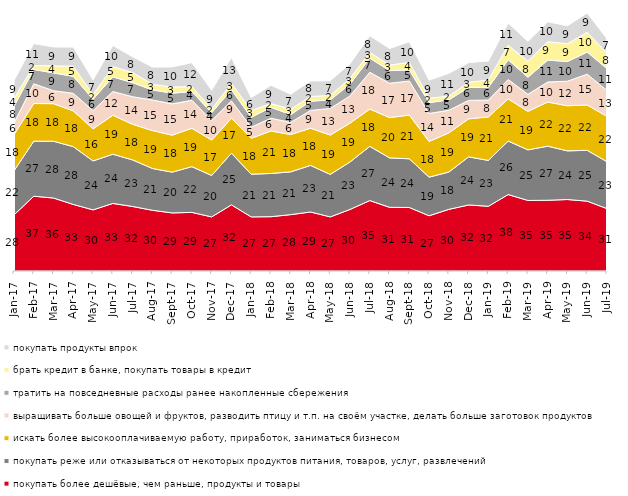
| Category | покупать более дешёвые, чем раньше, продукты и товары | покупать реже или отказываться от некоторых продуктов питания, товаров, услуг, развлечений | искать более высокооплачиваемую работу, приработок, заниматься бизнесом | выращивать больше овощей и фруктов, разводить птицу и т.п. на своём участке, делать больше заготовок продуктов  | тратить на повседневные расходы ранее накопленные сбережения | брать кредит в банке, покупать товары в кредит | покупать продукты впрок |
|---|---|---|---|---|---|---|---|
| 2017-01-01 | 27.5 | 21.65 | 17.8 | 5.7 | 8.15 | 3.75 | 8.85 |
| 2017-02-01 | 36.7 | 27 | 18.45 | 9.7 | 7.05 | 1.85 | 10.8 |
| 2017-03-01 | 35.8 | 27.85 | 18.45 | 6.35 | 8.7 | 3.5 | 9.25 |
| 2017-04-01 | 32.65 | 28.35 | 17.55 | 8.6 | 8.35 | 4.95 | 9.4 |
| 2017-05-01 | 30 | 24 | 15.75 | 8.9 | 5.6 | 2.2 | 7.3 |
| 2017-06-01 | 33.15 | 24.15 | 19.1 | 11.65 | 7.2 | 5 | 10.35 |
| 2017-07-01 | 31.65 | 22.85 | 17.5 | 13.5 | 6.9 | 4.95 | 7.75 |
| 2017-08-01 | 29.8 | 20.5 | 18.6 | 15 | 4.95 | 2.75 | 8.45 |
| 2017-09-01 | 28.5 | 20 | 18.15 | 15.35 | 5.25 | 3 | 9.85 |
| 2017-10-01 | 28.75 | 22.45 | 18.8 | 13.75 | 4.3 | 2.45 | 11.7 |
| 2017-11-01 | 26.55 | 20.3 | 17.4 | 9.6 | 3.8 | 1.7 | 9.3 |
| 2017-12-01 | 32.45 | 25.35 | 17.1 | 8.55 | 5.55 | 3.05 | 12.7 |
| 2018-01-01 | 26.55 | 20.95 | 17.6 | 5.45 | 4.85 | 3.3 | 6.35 |
| 2018-02-01 | 26.65 | 21.2 | 20.85 | 6.25 | 5.35 | 1.85 | 9 |
| 2018-03-01 | 27.65 | 21 | 18.3 | 5.95 | 3.85 | 2.65 | 7.35 |
| 2018-04-01 | 28.95 | 22.85 | 18.25 | 8.7 | 4.55 | 2.35 | 7.55 |
| 2018-05-01 | 26.55 | 20.85 | 19.3 | 13.05 | 4.2 | 2.15 | 7.25 |
| 2018-06-01 | 30.2 | 23.3 | 19.05 | 13.35 | 5.8 | 2.8 | 7.2 |
| 2018-07-01 | 34.55 | 26.6 | 18.3 | 18.05 | 6.95 | 2.75 | 8.25 |
| 2018-08-01 | 31.25 | 24.25 | 19.75 | 16.85 | 6.2 | 2.7 | 8.15 |
| 2018-09-01 | 31.15 | 23.9 | 21.45 | 16.7 | 5.45 | 3.7 | 10.1 |
| 2018-10-01 | 27.1 | 18.95 | 17.5 | 13.75 | 5.3 | 2.2 | 8.8 |
| 2018-11-01 | 30.24 | 18.313 | 19.212 | 11.078 | 5.14 | 1.796 | 11.178 |
| 2018-12-01 | 32.4 | 23.6 | 18.65 | 9.05 | 6.35 | 2.5 | 9.7 |
| 2019-01-01 | 31.75 | 22.5 | 21.35 | 8.25 | 6.25 | 3.65 | 9.25 |
| 2019-02-01 | 37.5 | 26.25 | 20.7 | 9.5 | 9.7 | 7.05 | 10.95 |
| 2019-03-01 | 34.61 | 24.814 | 18.896 | 8.354 | 8.404 | 7.857 | 9.697 |
| 2019-04-01 | 34.703 | 26.535 | 21.634 | 9.851 | 10.743 | 9.01 | 9.752 |
| 2019-05-01 | 35.067 | 23.873 | 22.14 | 12.036 | 9.658 | 8.717 | 8.816 |
| 2019-06-01 | 34.264 | 24.938 | 22.244 | 15.112 | 10.873 | 9.676 | 9.476 |
| 2019-07-01 | 30.594 | 23.02 | 22.228 | 12.723 | 10.693 | 7.624 | 7.03 |